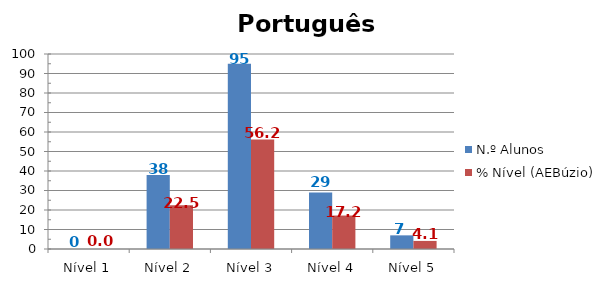
| Category | N.º Alunos | % Nível (AEBúzio) |
|---|---|---|
| Nível 1 | 0 | 0 |
| Nível 2 | 38 | 22.485 |
| Nível 3 | 95 | 56.213 |
| Nível 4 | 29 | 17.16 |
| Nível 5 | 7 | 4.142 |